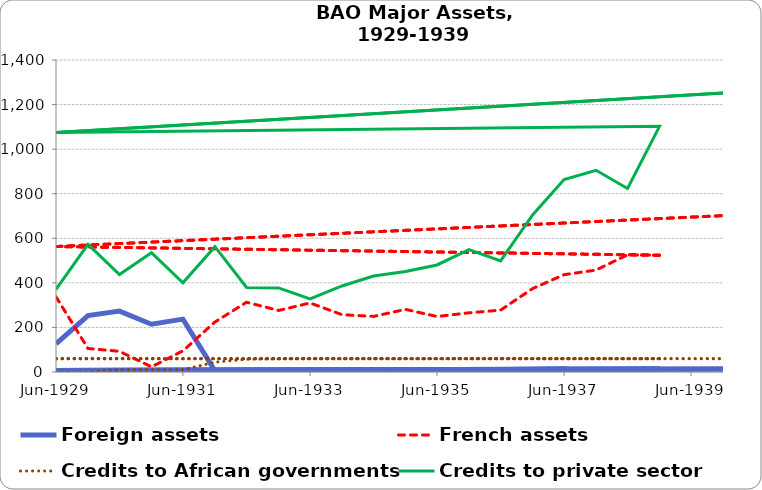
| Category | Foreign assets | French assets | Credits to African governments | Credits to private sector |
|---|---|---|---|---|
| 1929-06-30 | 126.664 | 337.31 | 0 | 370.447 |
| 1929-12-31 | 253.407 | 105.524 | 0 | 572.708 |
| 1930-06-30 | 273.14 | 92.824 | 10 | 437.558 |
| 1930-12-31 | 214.332 | 22.982 | 10 | 535.192 |
| 1931-06-30 | 237.308 | 94.949 | 10 | 400.494 |
| 1931-12-31 | 5.012 | 224.394 | 43.997 | 562.348 |
| 1932-06-30 | 1.559 | 313.027 | 57.235 | 379.176 |
| 1932-12-31 | 0.519 | 276.078 | 59.051 | 377.327 |
| 1933-06-30 | 0.25 | 309.851 | 59.59 | 328.303 |
| 1933-12-31 | 0.184 | 257.185 | 59.594 | 386.034 |
| 1934-06-30 | 0 | 249.4 | 59.618 | 430.603 |
| 1934-12-31 | 0 | 280.999 | 59.625 | 450.712 |
| 1935-06-30 | 0 | 248.988 | 59.639 | 480.272 |
| 1935-12-31 | 0 | 265.476 | 59.645 | 548.935 |
| 1936-06-30 | 11.012 | 277.693 | 59.645 | 498.392 |
| 1936-12-31 | 12.598 | 374.457 | 59.645 | 704.963 |
| 1937-06-30 | 14.082 | 436.661 | 59.65 | 863.527 |
| 1937-12-31 | 0 | 457.515 | 59.65 | 905.058 |
| 1938-06-30 | 11.213 | 525.768 | 59.65 | 823.61 |
| 1938-12-31 | 13.501 | 524.018 | 59.65 | 1102.434 |
| 1929-06-30 | 7.008 | 563.024 | 59.65 | 1074.322 |
| 1939-12-31 | 13.256 | 701.555 | 59.65 | 1252.339 |